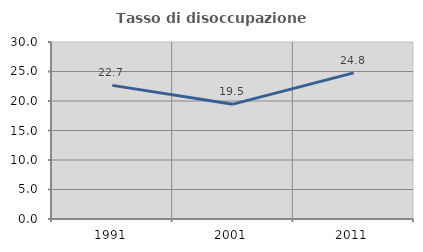
| Category | Tasso di disoccupazione giovanile  |
|---|---|
| 1991.0 | 22.651 |
| 2001.0 | 19.463 |
| 2011.0 | 24.762 |